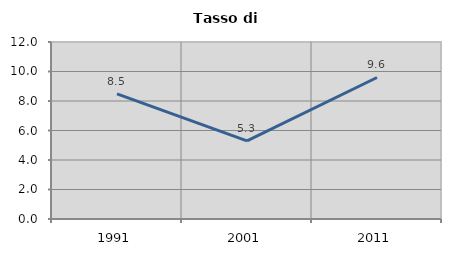
| Category | Tasso di disoccupazione   |
|---|---|
| 1991.0 | 8.479 |
| 2001.0 | 5.293 |
| 2011.0 | 9.593 |